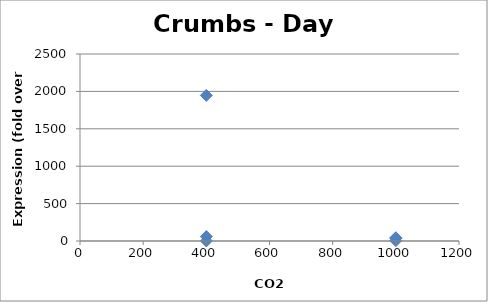
| Category | Series 0 |
|---|---|
| 1000.0 | 43.54 |
| 1000.0 | 4.988 |
| 1000.0 | 36.618 |
| 400.0 | 1 |
| 400.0 | 1946.371 |
| 400.0 | 59.315 |